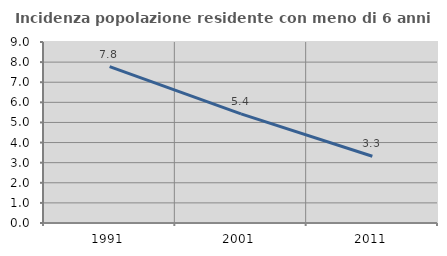
| Category | Incidenza popolazione residente con meno di 6 anni |
|---|---|
| 1991.0 | 7.778 |
| 2001.0 | 5.423 |
| 2011.0 | 3.32 |